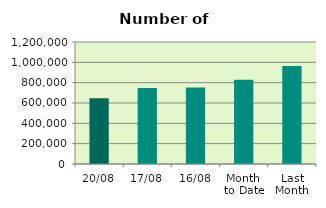
| Category | Series 0 |
|---|---|
| 20/08 | 646554 |
| 17/08 | 748276 |
| 16/08 | 752318 |
| Month 
to Date | 827820.143 |
| Last
Month | 964212.818 |